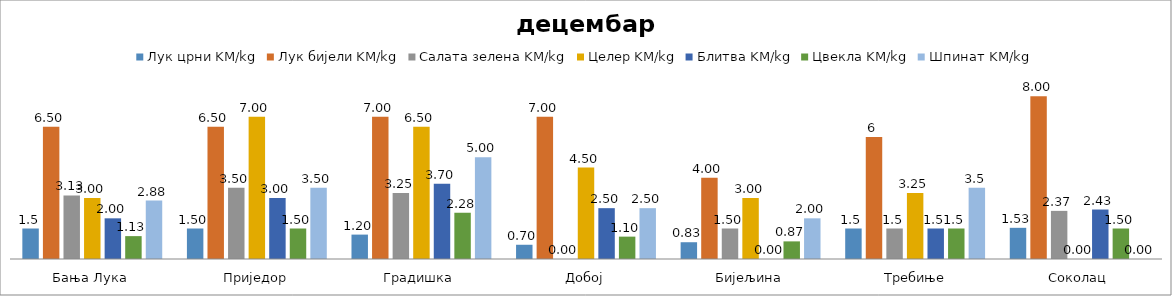
| Category | Лук црни KM/kg | Лук бијели KM/kg | Салата зелена KM/kg | Целер KM/kg | Блитва KM/kg | Цвекла KM/kg | Шпинат KM/kg |
|---|---|---|---|---|---|---|---|
| Бања Лука | 1.5 | 6.5 | 3.125 | 3 | 2 | 1.125 | 2.875 |
| Приједор | 1.5 | 6.5 | 3.5 | 7 | 3 | 1.5 | 3.5 |
| Градишка | 1.2 | 7 | 3.25 | 6.5 | 3.7 | 2.275 | 5 |
| Добој | 0.7 | 7 | 0 | 4.5 | 2.5 | 1.1 | 2.5 |
| Бијељина | 0.825 | 4 | 1.5 | 3 | 0 | 0.867 | 2 |
|  Требиње | 1.5 | 6 | 1.5 | 3.25 | 1.5 | 1.5 | 3.5 |
| Соколац | 1.533 | 8 | 2.367 | 0 | 2.433 | 1.5 | 0 |